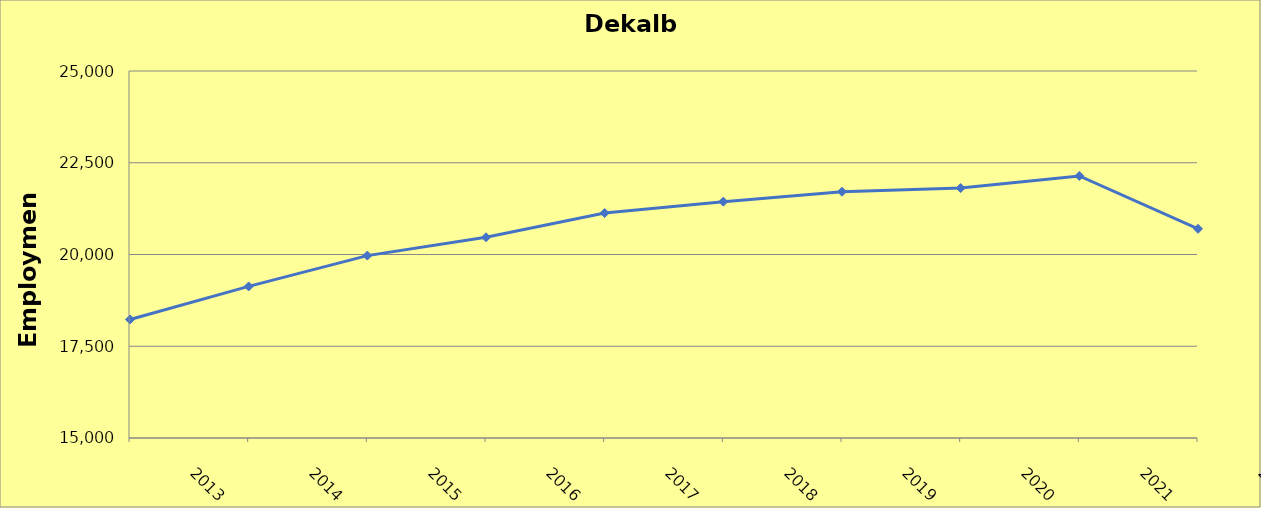
| Category | Dekalb County |
|---|---|
| 2013.0 | 18230 |
| 2014.0 | 19130 |
| 2015.0 | 19970 |
| 2016.0 | 20470 |
| 2017.0 | 21130 |
| 2018.0 | 21440 |
| 2019.0 | 21710 |
| 2020.0 | 21810 |
| 2021.0 | 22140 |
| 2022.0 | 20700 |